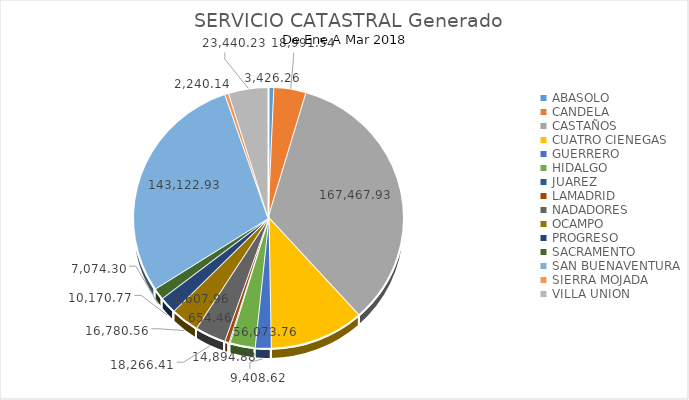
| Category | Series 0 |
|---|---|
| ABASOLO | 3426.26 |
| CANDELA | 18991.54 |
| CASTAÑOS | 167467.93 |
| CUATRO CIENEGAS | 56073.76 |
| GUERRERO | 9408.62 |
| HIDALGO | 14894.88 |
| JUAREZ | 654.46 |
| LAMADRID | 2607.96 |
| NADADORES | 18266.41 |
| OCAMPO | 16780.56 |
| PROGRESO | 10170.77 |
| SACRAMENTO | 7074.3 |
| SAN BUENAVENTURA | 143122.93 |
| SIERRA MOJADA | 2240.14 |
| VILLA UNION | 23440.23 |